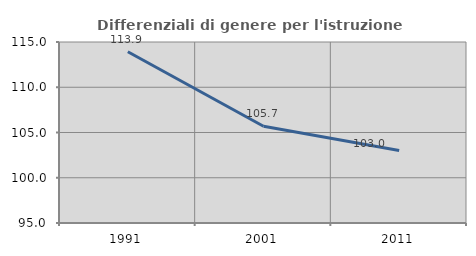
| Category | Differenziali di genere per l'istruzione superiore |
|---|---|
| 1991.0 | 113.922 |
| 2001.0 | 105.689 |
| 2011.0 | 103.018 |